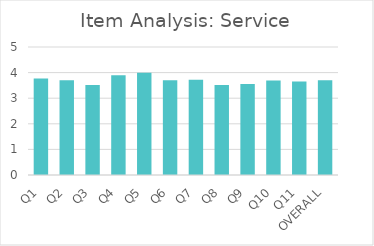
| Category | Series 0 |
|---|---|
| Q1 | 3.77 |
| Q2 | 3.7 |
| Q3 | 3.52 |
| Q4 | 3.9 |
| Q5 | 3.99 |
| Q6 | 3.7 |
| Q7 | 3.72 |
| Q8 | 3.52 |
| Q9 | 3.55 |
| Q10 | 3.69 |
| Q11 | 3.65 |
| OVERALL | 3.7 |